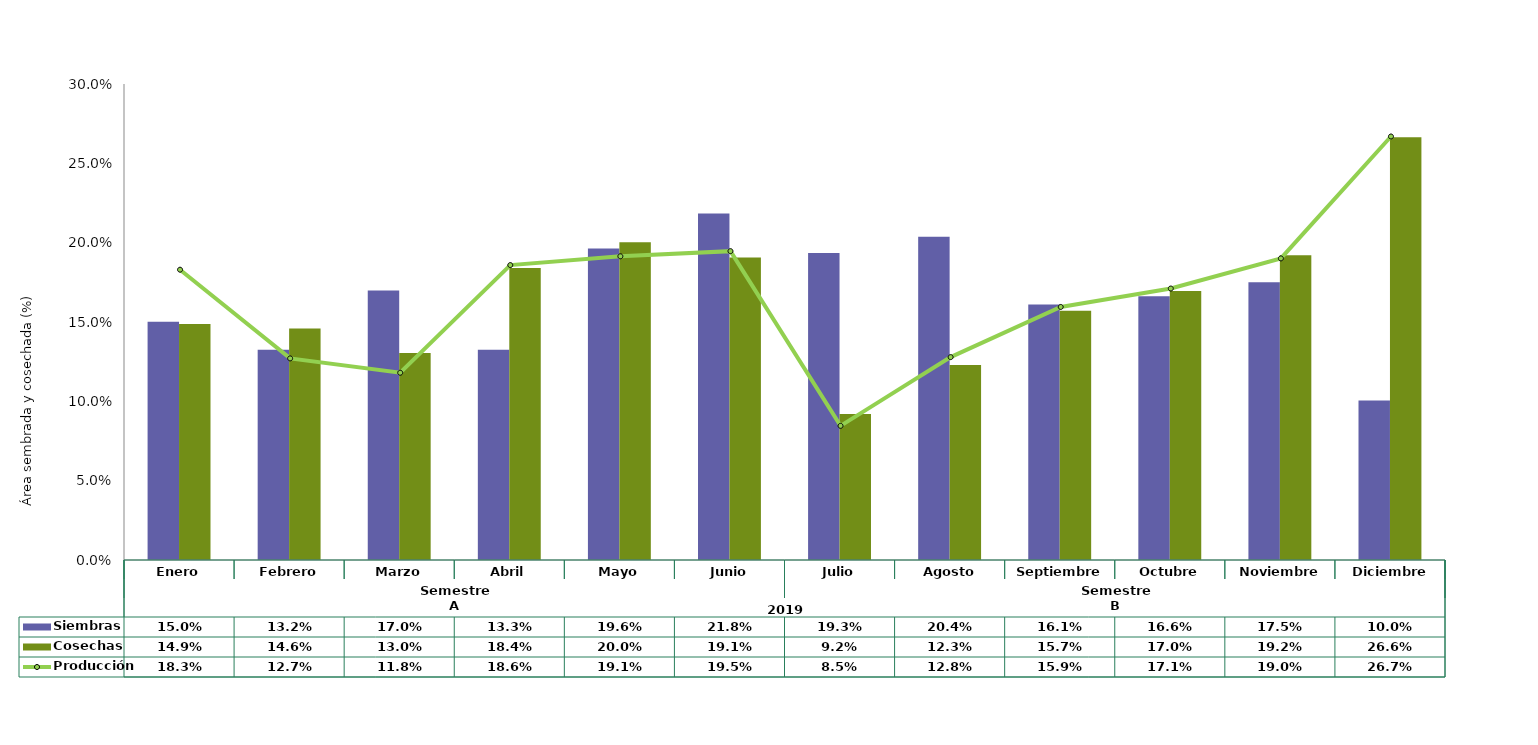
| Category | Siembras | Cosechas   |
|---|---|---|
| 0 | 0.15 | 0.149 |
| 1 | 0.132 | 0.146 |
| 2 | 0.17 | 0.13 |
| 3 | 0.133 | 0.184 |
| 4 | 0.196 | 0.2 |
| 5 | 0.218 | 0.191 |
| 6 | 0.193 | 0.092 |
| 7 | 0.204 | 0.123 |
| 8 | 0.161 | 0.157 |
| 9 | 0.166 | 0.17 |
| 10 | 0.175 | 0.192 |
| 11 | 0.1 | 0.266 |